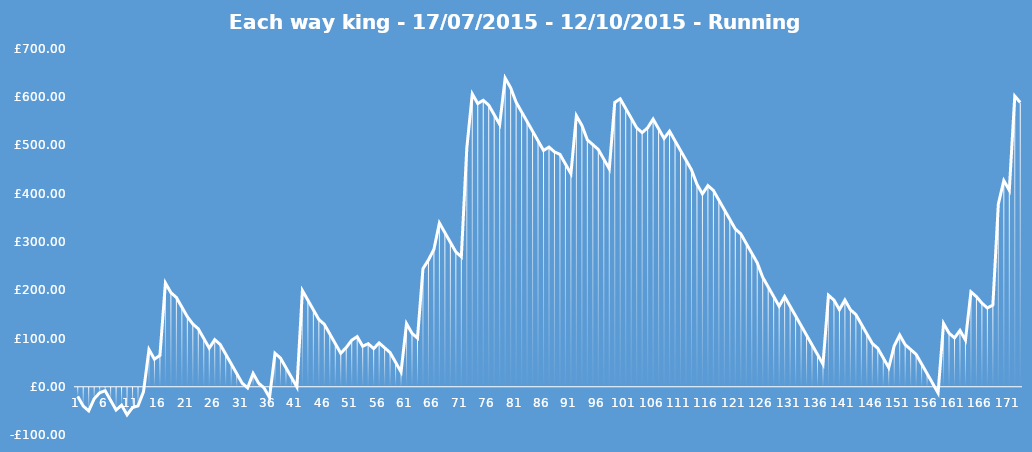
| Category | Running Bank |
|---|---|
| 0 | -20 |
| 1 | -40 |
| 2 | -50 |
| 3 | -25 |
| 4 | -12.5 |
| 5 | -8.2 |
| 6 | -28.2 |
| 7 | -48.2 |
| 8 | -38.2 |
| 9 | -58.2 |
| 10 | -43.2 |
| 11 | -39.6 |
| 12 | -10.4 |
| 13 | 77.1 |
| 14 | 57.1 |
| 15 | 65.1 |
| 16 | 215.1 |
| 17 | 195.1 |
| 18 | 185.1 |
| 19 | 165.1 |
| 20 | 145.1 |
| 21 | 130.1 |
| 22 | 120.1 |
| 23 | 100.1 |
| 24 | 80.1 |
| 25 | 97.6 |
| 26 | 87.6 |
| 27 | 67.6 |
| 28 | 47.6 |
| 29 | 27.6 |
| 30 | 7.6 |
| 31 | -2.4 |
| 32 | 27.6 |
| 33 | 7.6 |
| 34 | -2.4 |
| 35 | -22.4 |
| 36 | 69.4 |
| 37 | 59.4 |
| 38 | 39.4 |
| 39 | 19.4 |
| 40 | -0.6 |
| 41 | 199.4 |
| 42 | 179.4 |
| 43 | 159.4 |
| 44 | 139.4 |
| 45 | 129.4 |
| 46 | 109.4 |
| 47 | 89.4 |
| 48 | 69.4 |
| 49 | 81.4 |
| 50 | 96.4 |
| 51 | 103.9 |
| 52 | 83.9 |
| 53 | 89.2 |
| 54 | 79.2 |
| 55 | 90.8 |
| 56 | 80.8 |
| 57 | 70.8 |
| 58 | 50.8 |
| 59 | 30.8 |
| 60 | 130.8 |
| 61 | 110.8 |
| 62 | 100.8 |
| 63 | 244.8 |
| 64 | 262.8 |
| 65 | 284.8 |
| 66 | 339.4 |
| 67 | 319.4 |
| 68 | 299.4 |
| 69 | 279.4 |
| 70 | 269.4 |
| 71 | 494.4 |
| 72 | 606.9 |
| 73 | 586.9 |
| 74 | 593.7 |
| 75 | 583.7 |
| 76 | 563.7 |
| 77 | 543.7 |
| 78 | 639.7 |
| 79 | 619.7 |
| 80 | 589.7 |
| 81 | 569.7 |
| 82 | 549.7 |
| 83 | 529.7 |
| 84 | 509.7 |
| 85 | 489.7 |
| 86 | 496.7 |
| 87 | 486.7 |
| 88 | 481.7 |
| 89 | 461.7 |
| 90 | 441.7 |
| 91 | 561.7 |
| 92 | 541.7 |
| 93 | 511.7 |
| 94 | 501.7 |
| 95 | 491.7 |
| 96 | 471.7 |
| 97 | 451.7 |
| 98 | 589.2 |
| 99 | 596.7 |
| 100 | 576.7 |
| 101 | 556.7 |
| 102 | 536.7 |
| 103 | 526.7 |
| 104 | 536.7 |
| 105 | 554.7 |
| 106 | 534.7 |
| 107 | 514.7 |
| 108 | 529.7 |
| 109 | 509.7 |
| 110 | 489.7 |
| 111 | 469.7 |
| 112 | 449.7 |
| 113 | 419.7 |
| 114 | 399.7 |
| 115 | 416.9 |
| 116 | 406.9 |
| 117 | 386.9 |
| 118 | 366.9 |
| 119 | 346.9 |
| 120 | 326.9 |
| 121 | 316.9 |
| 122 | 296.9 |
| 123 | 276.9 |
| 124 | 256.9 |
| 125 | 226.9 |
| 126 | 206.9 |
| 127 | 186.9 |
| 128 | 166.9 |
| 129 | 186.9 |
| 130 | 166.9 |
| 131 | 146.9 |
| 132 | 126.9 |
| 133 | 106.9 |
| 134 | 86.9 |
| 135 | 66.9 |
| 136 | 46.9 |
| 137 | 189.7 |
| 138 | 179.7 |
| 139 | 159.7 |
| 140 | 179.7 |
| 141 | 159.7 |
| 142 | 149.7 |
| 143 | 129.7 |
| 144 | 109.7 |
| 145 | 89.7 |
| 146 | 79.7 |
| 147 | 59.7 |
| 148 | 39.7 |
| 149 | 84.7 |
| 150 | 107.2 |
| 151 | 87.2 |
| 152 | 77.2 |
| 153 | 67.2 |
| 154 | 47.2 |
| 155 | 27.2 |
| 156 | 7.2 |
| 157 | -12.8 |
| 158 | 131.2 |
| 159 | 111.2 |
| 160 | 101.2 |
| 161 | 116.7 |
| 162 | 96.7 |
| 163 | 196.7 |
| 164 | 186.7 |
| 165 | 173.3 |
| 166 | 163.3 |
| 167 | 169.3 |
| 168 | 378.7 |
| 169 | 427.3 |
| 170 | 407.3 |
| 171 | 602.5 |
| 172 | 589.1 |